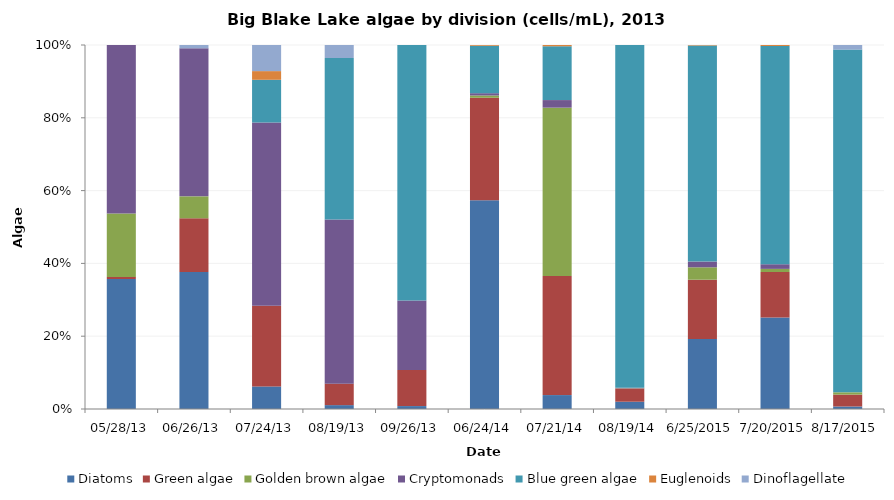
| Category | Diatoms | Green algae | Golden brown algae | Cryptomonads | Blue green algae | Euglenoids | Dinoflagellate |
|---|---|---|---|---|---|---|---|
| 2013-05-28 | 3276 | 52 | 1598 | 4245 | 0 | 0 | 0 |
| 2013-06-26 | 1774 | 695 | 284 | 1916 | 0 | 0 | 43 |
| 2013-07-24 | 260 | 930 | 0 | 2114 | 491 | 100 | 301 |
| 2013-08-19 | 163 | 900 | 0 | 6895 | 6786 | 0 | 545 |
| 2013-09-26 | 180 | 2224 | 0 | 4288 | 15749 | 0 | 0 |
| 2014-06-24 | 3180.328 | 1561.04 | 34.949 | 34.949 | 722.272 | 11.65 | 0 |
| 2014-07-21 | 484.336 | 4138.872 | 5856.064 | 264.183 | 1871.299 | 44.031 | 0 |
| 2014-08-19 | 1065.547 | 1937.359 | 32.289 | 64.579 | 50177.591 | 0 | 0 |
| 2015-06-25 | 874 | 741 | 155 | 72 | 2699 | 6 | 0 |
| 2015-07-20 | 7113 | 3536 | 241 | 362 | 16958 | 80 | 0 |
| 2015-08-17 | 408 | 1939 | 374 | 0 | 55823 | 0 | 748 |